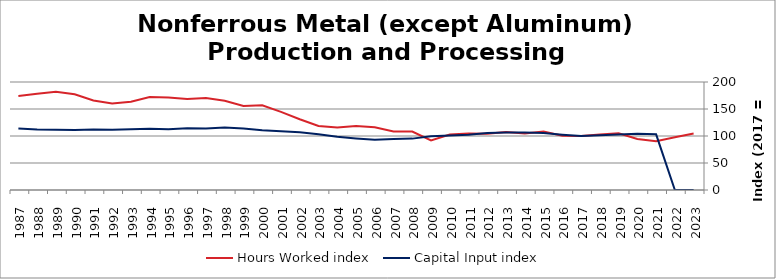
| Category | Hours Worked index | Capital Input index |
|---|---|---|
| 2023.0 | 104.529 | 0 |
| 2022.0 | 97.677 | 0 |
| 2021.0 | 90.312 | 103.058 |
| 2020.0 | 94.463 | 104.113 |
| 2019.0 | 105.073 | 102.939 |
| 2018.0 | 102.994 | 101.19 |
| 2017.0 | 100 | 100 |
| 2016.0 | 100.624 | 102.537 |
| 2015.0 | 108.416 | 105.372 |
| 2014.0 | 104.74 | 106.339 |
| 2013.0 | 107.235 | 106.631 |
| 2012.0 | 104.138 | 105.487 |
| 2011.0 | 104.754 | 102.416 |
| 2010.0 | 102.727 | 100.846 |
| 2009.0 | 91.85 | 99.626 |
| 2008.0 | 108.274 | 95.145 |
| 2007.0 | 108.311 | 94.539 |
| 2006.0 | 116.255 | 93.034 |
| 2005.0 | 118.683 | 95.459 |
| 2004.0 | 115.541 | 98.644 |
| 2003.0 | 118.514 | 103.358 |
| 2002.0 | 130.977 | 107.035 |
| 2001.0 | 144.59 | 108.701 |
| 2000.0 | 156.999 | 110.804 |
| 1999.0 | 155.454 | 113.826 |
| 1998.0 | 165.192 | 115.691 |
| 1997.0 | 170.32 | 114.113 |
| 1996.0 | 168.598 | 114.379 |
| 1995.0 | 171.096 | 112.559 |
| 1994.0 | 172.163 | 113.285 |
| 1993.0 | 163.626 | 112.503 |
| 1992.0 | 160.387 | 111.596 |
| 1991.0 | 165.621 | 111.83 |
| 1990.0 | 177.333 | 111.284 |
| 1989.0 | 181.758 | 111.567 |
| 1988.0 | 178.035 | 112.062 |
| 1987.0 | 174.292 | 113.885 |